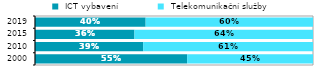
| Category |  ICT vybavení |  Telekomunikační služby |
|---|---|---|
| 2000.0 | 0.547 | 0.453 |
| 2010.0 | 0.389 | 0.611 |
| 2015.0 | 0.358 | 0.642 |
| 2019.0 | 0.398 | 0.602 |